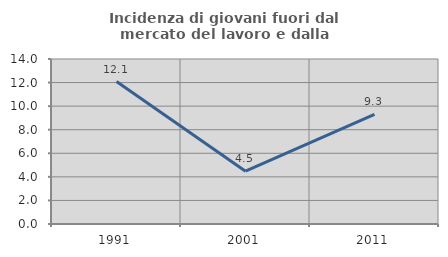
| Category | Incidenza di giovani fuori dal mercato del lavoro e dalla formazione  |
|---|---|
| 1991.0 | 12.083 |
| 2001.0 | 4.478 |
| 2011.0 | 9.302 |